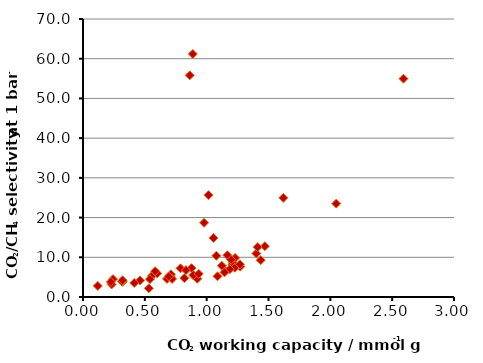
| Category | Series 0 |
|---|---|
| 0.8780087619296835 | 7.259 |
| 1.271243506090594 | 7.633 |
| 0.5578499358194285 | 5.336 |
| 0.863030003369389 | 55.816 |
| 0.24270144778637767 | 4.518 |
| 0.32073650212604976 | 3.819 |
| 0.9790581151855995 | 18.685 |
| 0.6004925576413329 | 5.928 |
| 0.708179717149005 | 5.179 |
| 0.7105654747261471 | 5.697 |
| 1.2085271415300052 | 8.131 |
| 1.1540712923692908 | 6.509 |
| 1.2108934783601044 | 8.569 |
| 1.4376052330399833 | 9.286 |
| 0.8878192445862905 | 61.196 |
| 1.014791061898717 | 25.646 |
| 0.4611998067658204 | 4.183 |
| 0.7882202328431775 | 7.227 |
| 1.6201545171860703 | 24.969 |
| 0.5325118754709823 | 2.185 |
| 1.2276078648299997 | 7.361 |
| 1.1222581324547045 | 7.871 |
| 0.8327543346486525 | 6.762 |
| 1.1871813635984272 | 6.998 |
| 0.5831960035536816 | 6.508 |
| 0.8935490644251209 | 5.421 |
| 0.6795835457803794 | 4.542 |
| 0.23171191287624082 | 3.169 |
| 2.591449910316671 | 54.969 |
| 1.167617350494074 | 10.51 |
| 0.22573521127107046 | 3.789 |
| 1.2300642607517036 | 9.849 |
| 0.9246298683478258 | 4.603 |
| 1.4705171328026683 | 12.79 |
| 1.1440547946944548 | 6.221 |
| 0.5412996408566739 | 4.501 |
| 1.0552770103716678 | 14.867 |
| 0.315667225103241 | 3.885 |
| 1.4021135392715125 | 10.953 |
| 1.412332836330249 | 12.564 |
| 1.0784937243233674 | 10.383 |
| 1.0876399815713198 | 5.219 |
| 0.3199397579370156 | 4.208 |
| 0.41455169650149504 | 3.529 |
| 0.8197928129923562 | 4.749 |
| 0.7205265553948308 | 4.551 |
| 1.2685994925051598 | 8.22 |
| 0.6930039828582113 | 5.162 |
| 1.1983045419751024 | 9.386 |
| 2.047991446052786 | 23.519 |
| 0.8918269358679012 | 5.533 |
| 0.11941112715929113 | 2.792 |
| 0.9360341565250159 | 5.832 |